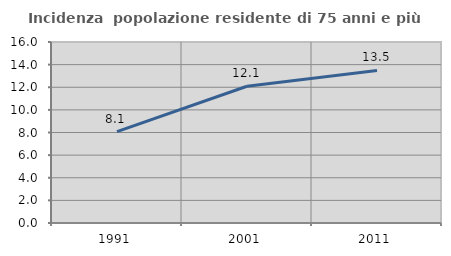
| Category | Incidenza  popolazione residente di 75 anni e più |
|---|---|
| 1991.0 | 8.073 |
| 2001.0 | 12.088 |
| 2011.0 | 13.485 |